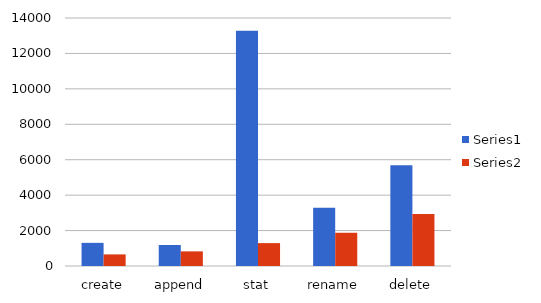
| Category | Series 0 | Series 1 |
|---|---|---|
| create | 1307 | 655 |
| append | 1187 | 826 |
| stat | 13280 | 1292 |
| rename | 3288 | 1877 |
| delete | 5693 | 2942 |